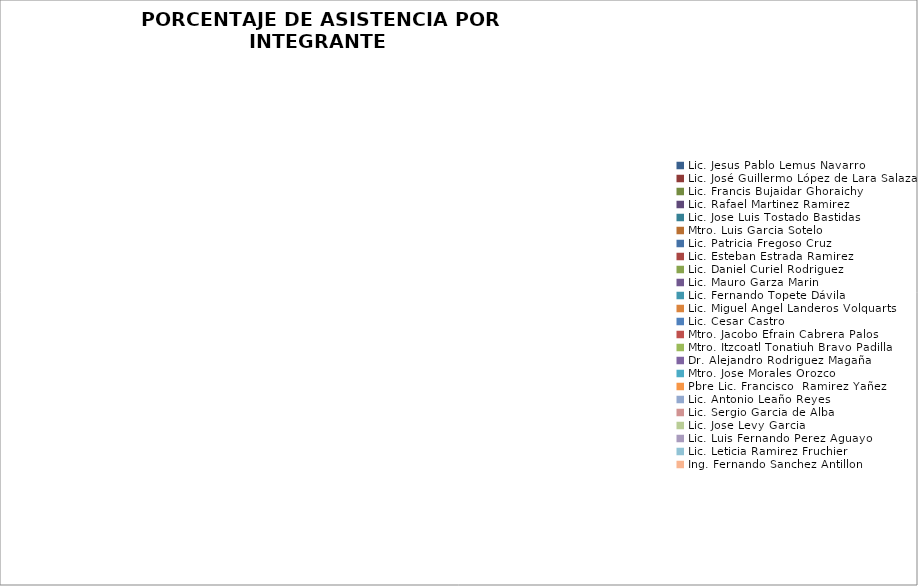
| Category | Series 0 |
|---|---|
| Lic. Jesus Pablo Lemus Navarro | 0 |
| Lic. José Guillermo López de Lara Salazar | 0 |
| Lic. Francis Bujaidar Ghoraichy | 0 |
| Lic. Rafael Martinez Ramirez | 0 |
| Lic. Jose Luis Tostado Bastidas | 0 |
| Mtro. Luis Garcia Sotelo | 0 |
| Lic. Patricia Fregoso Cruz | 0 |
| Lic. Esteban Estrada Ramirez | 0 |
| Lic. Daniel Curiel Rodriguez | 0 |
| Lic. Mauro Garza Marin | 0 |
| Lic. Fernando Topete Dávila | 0 |
| Lic. Miguel Angel Landeros Volquarts | 0 |
| Lic. Cesar Castro | 0 |
| Mtro. Jacobo Efrain Cabrera Palos | 0 |
| Mtro. Itzcoatl Tonatiuh Bravo Padilla | 0 |
| Dr. Alejandro Rodriguez Magaña | 0 |
| Mtro. Jose Morales Orozco | 0 |
| Pbre Lic. Francisco  Ramirez Yañez | 0 |
| Lic. Antonio Leaño Reyes | 0 |
| Lic. Sergio Garcia de Alba | 0 |
| Lic. Jose Levy Garcia | 0 |
| Lic. Luis Fernando Perez Aguayo | 0 |
| Lic. Leticia Ramirez Fruchier | 0 |
| Ing. Fernando Sanchez Antillon | 0 |